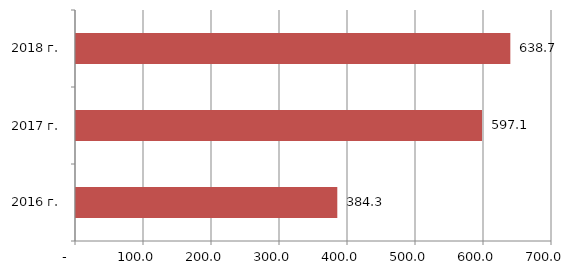
| Category | Series 0 |
|---|---|
| 2016 г. | 384.259 |
| 2017 г. | 597.139 |
| 2018 г. | 638.722 |